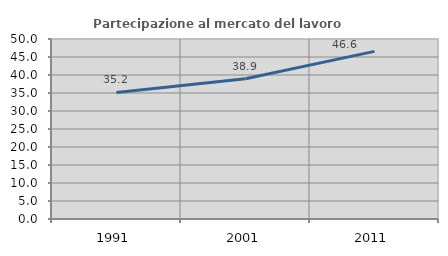
| Category | Partecipazione al mercato del lavoro  femminile |
|---|---|
| 1991.0 | 35.17 |
| 2001.0 | 38.935 |
| 2011.0 | 46.561 |